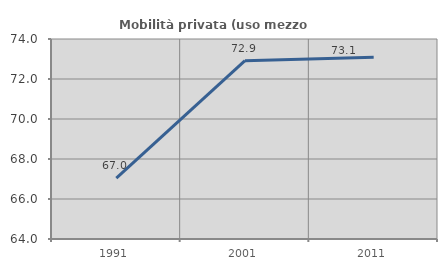
| Category | Mobilità privata (uso mezzo privato) |
|---|---|
| 1991.0 | 67.039 |
| 2001.0 | 72.917 |
| 2011.0 | 73.092 |